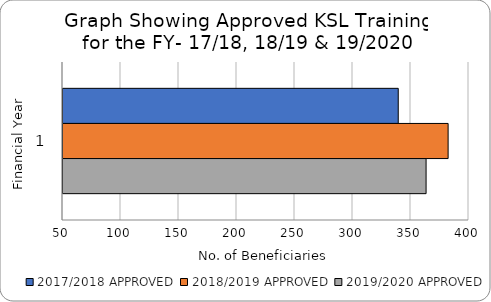
| Category | 2017/2018 APPROVED | 2018/2019 APPROVED | 2019/2020 APPROVED |
|---|---|---|---|
| 0 | 339 | 382 | 363 |